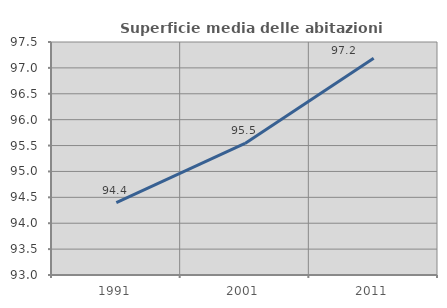
| Category | Superficie media delle abitazioni occupate |
|---|---|
| 1991.0 | 94.4 |
| 2001.0 | 95.542 |
| 2011.0 | 97.184 |